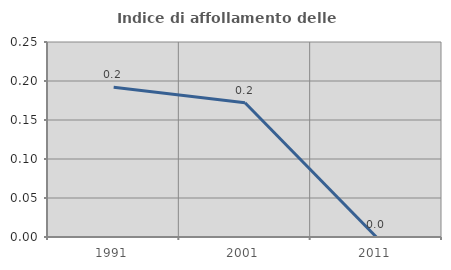
| Category | Indice di affollamento delle abitazioni  |
|---|---|
| 1991.0 | 0.192 |
| 2001.0 | 0.172 |
| 2011.0 | 0 |